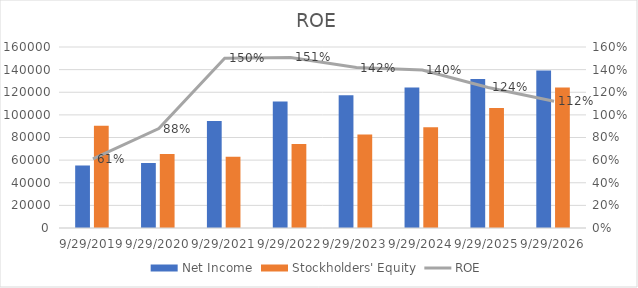
| Category | Net Income | Stockholders' Equity |
|---|---|---|
| 9/29/2019 | 55256 | 90488 |
| 9/29/2020 | 57411 | 65339 |
| 9/29/2021 | 94680 | 63090 |
| 9/29/2022 | 111866.274 | 74205.007 |
| 9/29/2023 | 117305.039 | 82702.668 |
| 9/29/2024 | 124211.372 | 88997.995 |
| 9/29/2025 | 131734.795 | 106047.02 |
| 9/29/2026 | 139122.006 | 124208.763 |